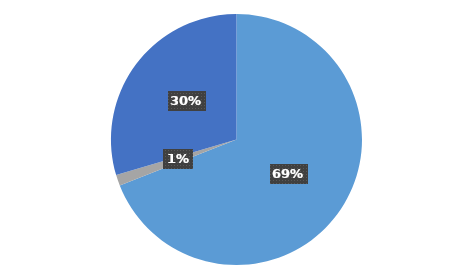
| Category | Series 0 |
|---|---|
| 0 | 49 |
| 1 | 1 |
| 2 | 21 |